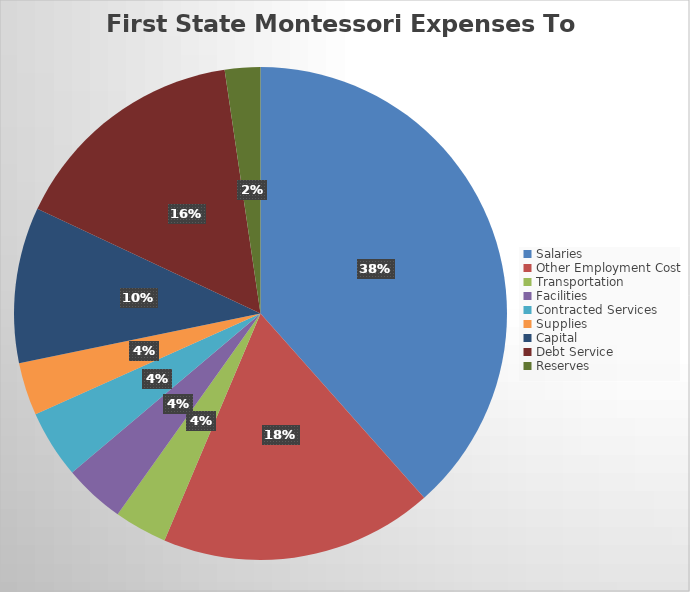
| Category | Series 0 |
|---|---|
| Salaries | 1652675.56 |
| Other Employment Cost | 770704.78 |
| Transportation | 149150.64 |
| Facilities | 172187.43 |
| Contracted Services | 191558.61 |
| Supplies | 149213.22 |
| Capital | 438919.52 |
| Debt Service | 674600 |
| Reserves | 100000 |